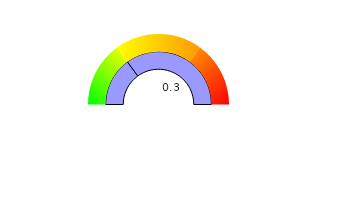
| Category | Series 0 | Series 1 |
|---|---|---|
| 0 | 0.3 | 30 |
| 1 | 0.7 | 40 |
| 2 | 0.5 | 30 |
| 3 | 0.5 | 100 |